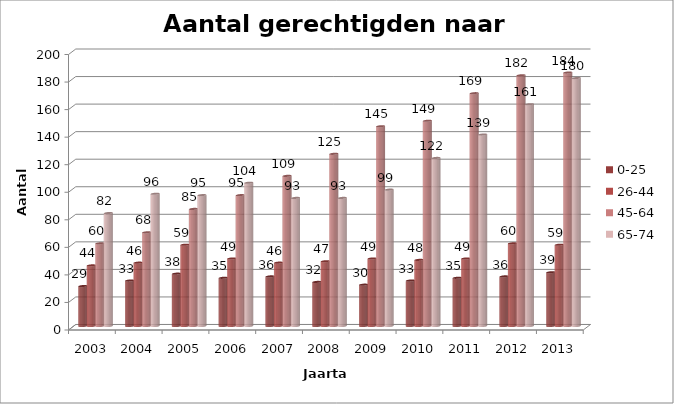
| Category | 0-25 | 26-44 | 45-64 | 65-74 | 75-64 | >=85 |
|---|---|---|---|---|---|---|
| 2003.0 | 29 | 44 | 60 | 82 |  |  |
| 2004.0 | 33 | 46 | 68 | 96 |  |  |
| 2005.0 | 38 | 59 | 85 | 95 |  |  |
| 2006.0 | 35 | 49 | 95 | 104 |  |  |
| 2007.0 | 36 | 46 | 109 | 93 |  |  |
| 2008.0 | 32 | 47 | 125 | 93 |  |  |
| 2009.0 | 30 | 49 | 145 | 99 |  |  |
| 2010.0 | 33 | 48 | 149 | 122 |  |  |
| 2011.0 | 35 | 49 | 169 | 139 |  |  |
| 2012.0 | 36 | 60 | 182 | 161 |  |  |
| 2013.0 | 39 | 59 | 184 | 180 |  |  |